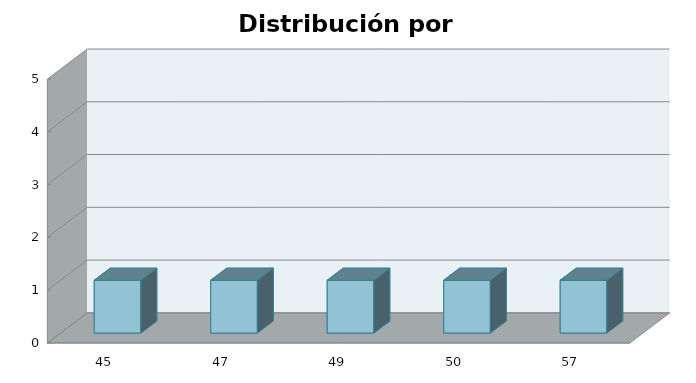
| Category | Series 1 |
|---|---|
| 45.0 | 1 |
| 47.0 | 1 |
| 49.0 | 1 |
| 50.0 | 1 |
| 57.0 | 1 |